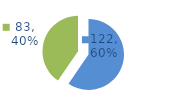
| Category | Series 0 |
|---|---|
| 0 | 122 |
| 1 | 83 |